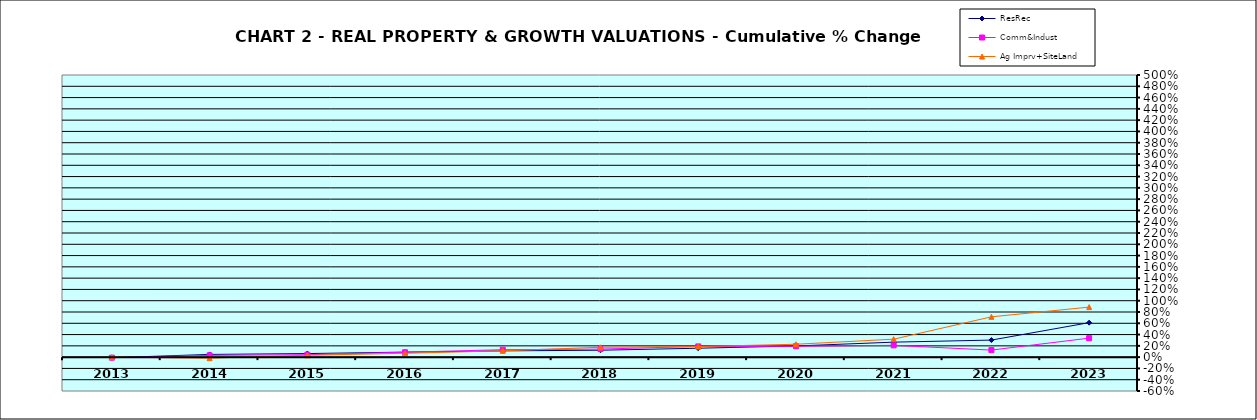
| Category | ResRec | Comm&Indust | Ag Imprv+SiteLand |
|---|---|---|---|
| 2013.0 | -0.01 | -0.009 | 0 |
| 2014.0 | 0.048 | 0.032 | -0.017 |
| 2015.0 | 0.064 | 0.043 | 0.034 |
| 2016.0 | 0.089 | 0.087 | 0.069 |
| 2017.0 | 0.111 | 0.132 | 0.112 |
| 2018.0 | 0.123 | 0.142 | 0.175 |
| 2019.0 | 0.158 | 0.19 | 0.187 |
| 2020.0 | 0.198 | 0.193 | 0.229 |
| 2021.0 | 0.266 | 0.209 | 0.318 |
| 2022.0 | 0.302 | 0.125 | 0.714 |
| 2023.0 | 0.611 | 0.337 | 0.886 |